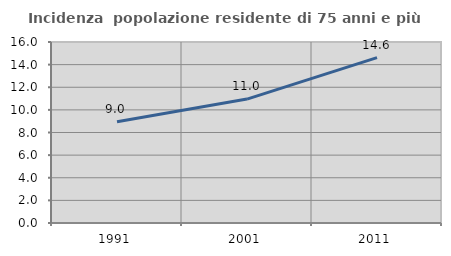
| Category | Incidenza  popolazione residente di 75 anni e più |
|---|---|
| 1991.0 | 8.951 |
| 2001.0 | 10.953 |
| 2011.0 | 14.625 |